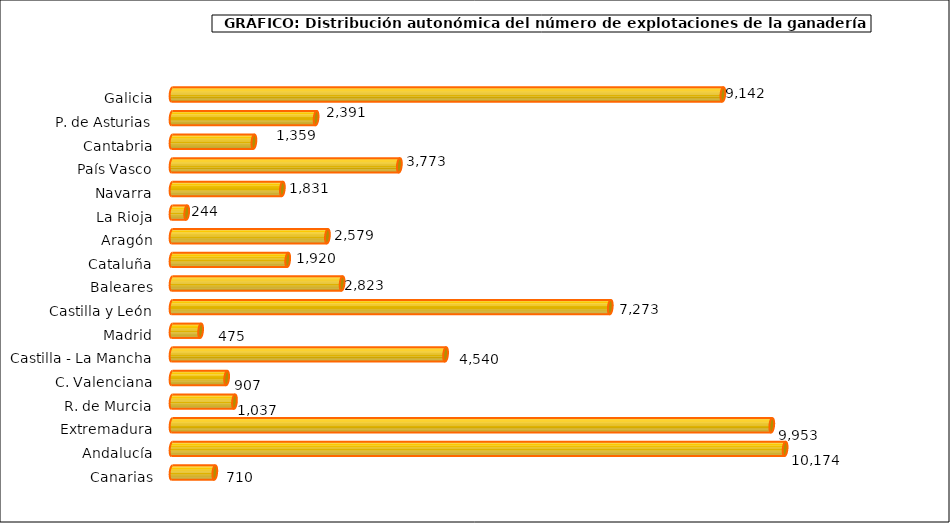
| Category | num. Explotaciones |
|---|---|
|   Galicia | 9142 |
|   P. de Asturias | 2391 |
|   Cantabria | 1359 |
|   País Vasco | 3773 |
|   Navarra | 1831 |
|   La Rioja | 244 |
|   Aragón | 2579 |
|   Cataluña | 1920 |
|   Baleares | 2823 |
|   Castilla y León | 7273 |
|   Madrid | 475 |
|   Castilla - La Mancha | 4540 |
|   C. Valenciana | 907 |
|   R. de Murcia | 1037 |
|   Extremadura | 9953 |
|   Andalucía | 10174 |
|   Canarias | 710 |